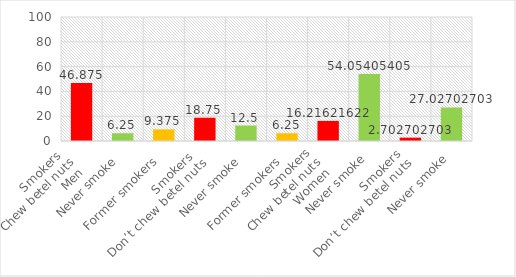
| Category | % |
|---|---|
| 0 | 46.875 |
| 1 | 6.25 |
| 2 | 9.375 |
| 3 | 18.75 |
| 4 | 12.5 |
| 5 | 6.25 |
| 6 | 16.216 |
| 7 | 54.054 |
| 8 | 2.703 |
| 9 | 27.027 |